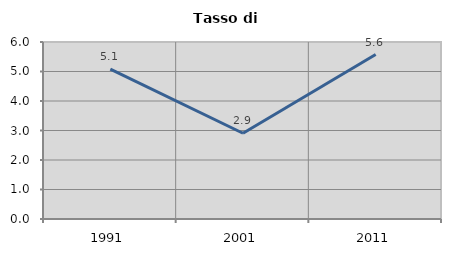
| Category | Tasso di disoccupazione   |
|---|---|
| 1991.0 | 5.083 |
| 2001.0 | 2.906 |
| 2011.0 | 5.575 |